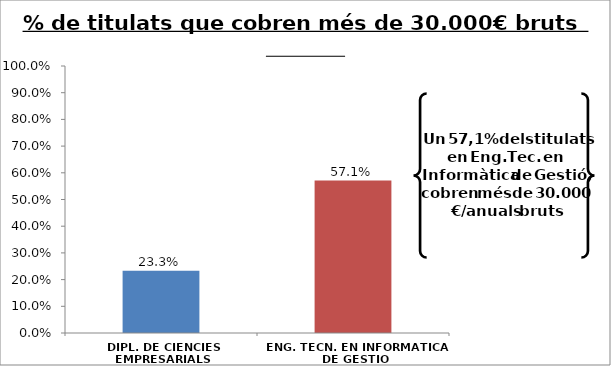
| Category | Series 0 |
|---|---|
| DIPL. DE CIENCIES EMPRESARIALS | 0.233 |
| ENG. TECN. EN INFORMATICA DE GESTIO | 0.571 |